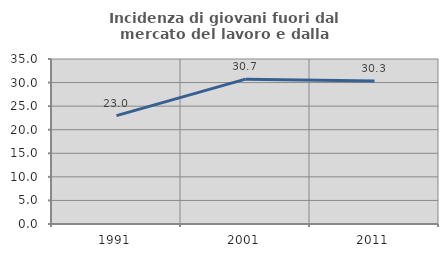
| Category | Incidenza di giovani fuori dal mercato del lavoro e dalla formazione  |
|---|---|
| 1991.0 | 22.998 |
| 2001.0 | 30.724 |
| 2011.0 | 30.324 |